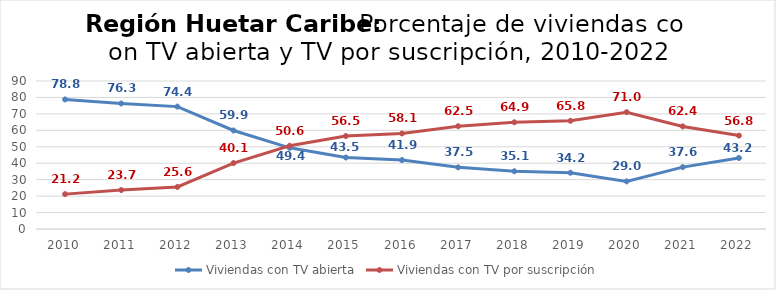
| Category | Viviendas con TV abierta | Viviendas con TV por suscripción |
|---|---|---|
| 2010.0 | 78.793 | 21.207 |
| 2011.0 | 76.322 | 23.678 |
| 2012.0 | 74.427 | 25.573 |
| 2013.0 | 59.902 | 40.098 |
| 2014.0 | 49.367 | 50.633 |
| 2015.0 | 43.482 | 56.518 |
| 2016.0 | 41.9 | 58.1 |
| 2017.0 | 37.495 | 62.505 |
| 2018.0 | 35.118 | 64.882 |
| 2019.0 | 34.206 | 65.794 |
| 2020.0 | 28.966 | 71.034 |
| 2021.0 | 37.625 | 62.375 |
| 2022.0 | 43.203 | 56.797 |